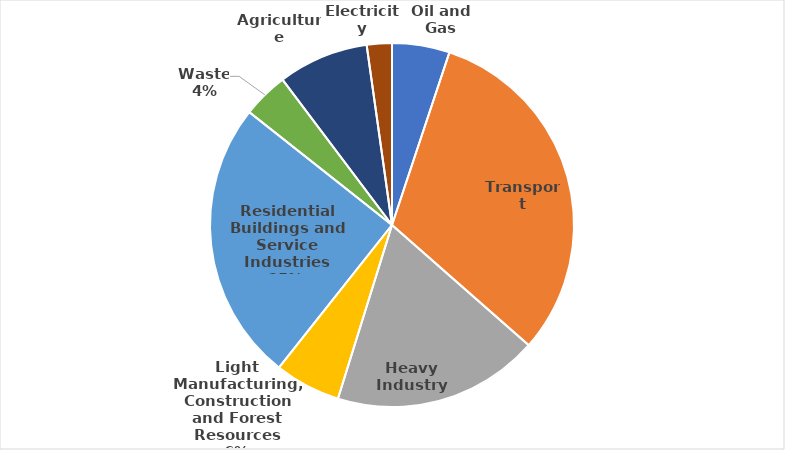
| Category | Series 0 |
|---|---|
| Oil and Gas | 7.696 |
| Transport | 47.224 |
| Heavy Industry | 27.593 |
| Light Manufacturing, Construction and Forest Resources | 8.829 |
| Residential Buildings and Service Industries | 37.611 |
| Waste | 6.139 |
| Agriculture | 12.114 |
| Electricity | 3.355 |